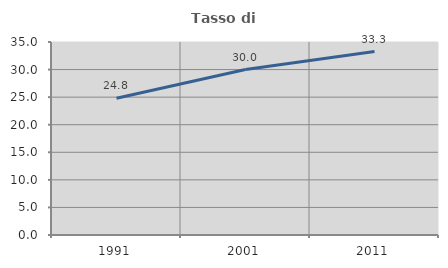
| Category | Tasso di occupazione   |
|---|---|
| 1991.0 | 24.799 |
| 2001.0 | 30.006 |
| 2011.0 | 33.263 |